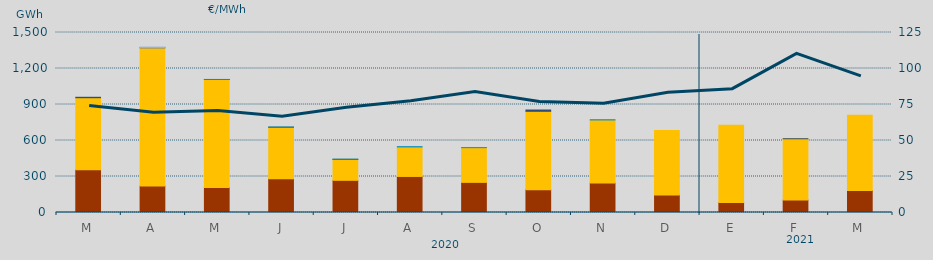
| Category | Carbón | Ciclo Combinado | Consumo Bombeo | Cogeneración | Hidráulica | Turbinación bombeo |
|---|---|---|---|---|---|---|
| M | 355297 | 601360.3 | 3495.6 | 0 | 0 | 0 |
| A | 220571 | 1152051.4 | 585 | 0 | 0 | 5000 |
| M | 207721 | 900435.9 | 185 | 0 | 630 | 0 |
| J | 281442 | 429259.5 | 370 | 0 | 680 | 0 |
| J | 268136 | 174851.8 | 11.5 | 0 | 1020 | 0 |
| A | 300478 | 246096.4 | 0 | 0 | 2161.8 | 0 |
| S | 250957 | 289538.3 | 0 | 0 | 33.4 | 0 |
| O | 189825 | 653476.1 | 10686 | 0 | 0 | 0 |
| N | 244862 | 526555 | 0 | 0 | 1376.6 | 0 |
| D | 145998 | 537825.1 | 0 | 0 | 0 | 0 |
| E | 82898 | 644611.7 | 0 | 0 | 0 | 0 |
| F | 103840 | 510673.9 | 0 | 28 | 0 | 0 |
| M | 182851 | 627886.9 | 0 | 0 | 0 | 0 |